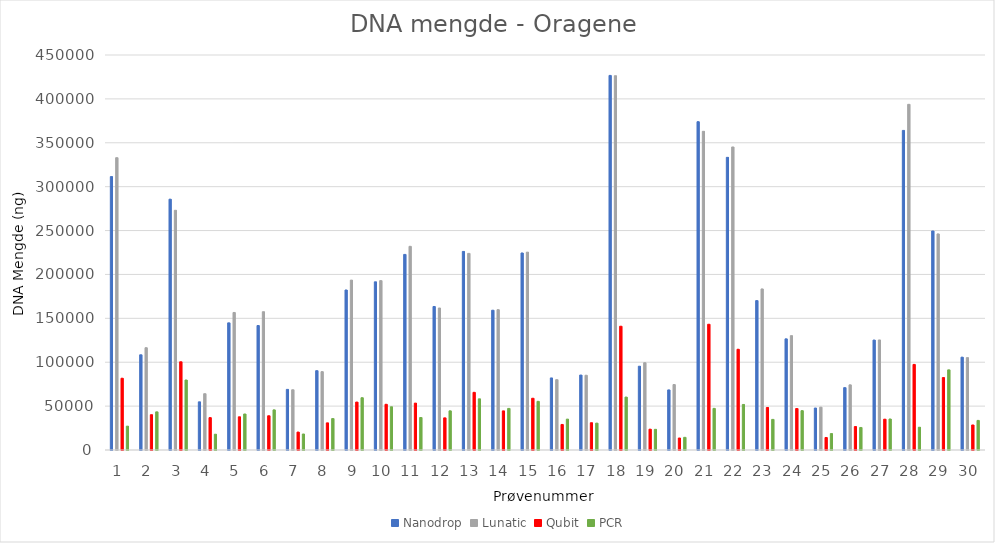
| Category | Nanodrop | Lunatic | Qubit | PCR |
|---|---|---|---|---|
| 1.0 | 311457 | 333015 | 81750 | 27160.5 |
| 2.0 | 108447 | 116520 | 40200 | 43443 |
| 3.0 | 285721.5 | 273090 | 100500 | 79726.5 |
| 4.0 | 54846 | 64125 | 36900 | 17961 |
| 5.0 | 144840 | 156675 | 37800 | 41014.5 |
| 6.0 | 141813 | 157530 | 39000 | 45702 |
| 7.0 | 69060 | 68610 | 20400 | 18211.5 |
| 8.0 | 90364.5 | 89265 | 30900 | 35802 |
| 9.0 | 182280 | 193530 | 54600 | 59557.5 |
| 10.0 | 191577 | 192945 | 52050 | 49203 |
| 11.0 | 222820.5 | 232020 | 53400 | 37014 |
| 12.0 | 163485 | 161745 | 36600 | 44599.5 |
| 13.0 | 226222.5 | 223995 | 65700 | 58261.5 |
| 14.0 | 159232.5 | 159855 | 44550 | 47368.5 |
| 15.0 | 224460 | 225375 | 58950 | 55425 |
| 16.0 | 82083 | 80100 | 29100 | 35158.5 |
| 17.0 | 85380 | 85155 | 31050 | 30603 |
| 18.0 | 426748.5 | 426390 | 141000 | 60282 |
| 19.0 | 95433 | 99420 | 23700 | 23548.5 |
| 20.0 | 68448 | 74550 | 13650 | 14419.5 |
| 21.0 | 374019 | 363045 | 143250 | 47413.5 |
| 22.0 | 333390 | 345240 | 114750 | 51877.5 |
| 23.0 | 170197.5 | 183480 | 48450 | 34869 |
| 24.0 | 126615 | 130245 | 47250 | 44809.5 |
| 25.0 | 47814 | 48780 | 14250 | 18694.5 |
| 26.0 | 71032.5 | 74220 | 26700 | 25662 |
| 27.0 | 125236.5 | 125355 | 35100 | 35325 |
| 28.0 | 364092 | 393795 | 97500 | 25935 |
| 29.0 | 249505.5 | 246165 | 82500 | 91293 |
| 30.0 | 105744 | 105210 | 28500 | 33714 |